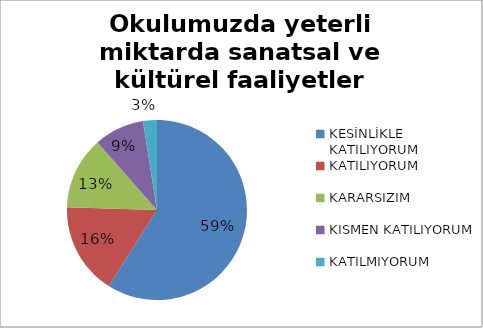
| Category | Okulumuzda yeterli miktarda sanatsal ve kültürel faaliyetler düzenlenmektedir. |
|---|---|
| KESİNLİKLE KATILIYORUM | 118 |
| KATILIYORUM | 33 |
| KARARSIZIM | 26 |
| KISMEN KATILIYORUM | 18 |
| KATILMIYORUM | 5 |